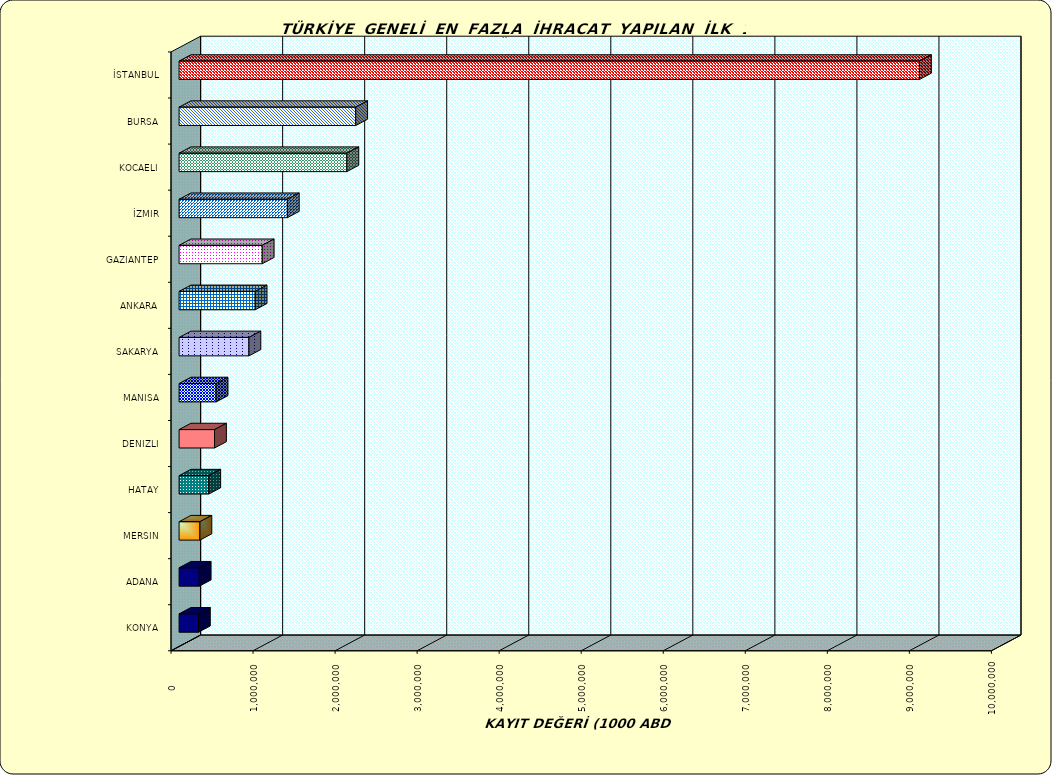
| Category | Series 0 |
|---|---|
| İSTANBUL | 9025588.592 |
| BURSA | 2153289.973 |
| KOCAELI | 2045695.341 |
| İZMIR | 1319817.706 |
| GAZIANTEP | 1013679.952 |
| ANKARA | 927597.551 |
| SAKARYA | 851817.408 |
| MANISA | 451583.472 |
| DENIZLI | 432226.446 |
| HATAY | 362142.35 |
| MERSIN | 254400.352 |
| ADANA | 245724.819 |
| KONYA | 236070.181 |